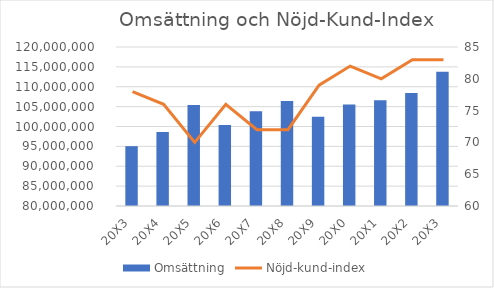
| Category | Omsättning |
|---|---|
| 20X3 | 95048573 |
| 20X4 | 98637493 |
| 20X5 | 105393736 |
| 20X6 | 100384765 |
| 20X7 | 103837463 |
| 20X8 | 106383756 |
| 20X9 | 102483726 |
| 20X0 | 105558237.78 |
| 20X1 | 106613820.158 |
| 20X2 | 108415405.553 |
| 20X3 | 113756946.108 |